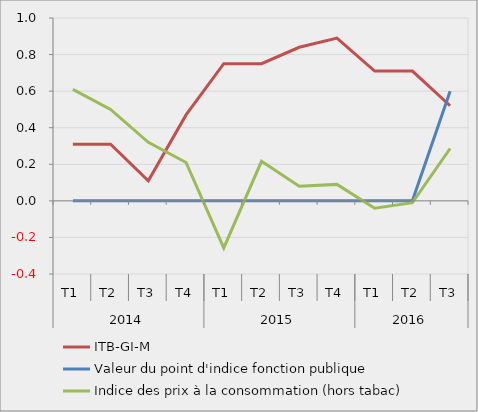
| Category | ITB-GI-M | Valeur du point d'indice fonction publique | Indice des prix à la consommation (hors tabac) |
|---|---|---|---|
| 0 | 0.31 | 0 | 0.61 |
| 1 | 0.31 | 0 | 0.5 |
| 2 | 0.11 | 0 | 0.32 |
| 3 | 0.47 | 0 | 0.21 |
| 4 | 0.75 | 0 | -0.257 |
| 5 | 0.75 | 0 | 0.216 |
| 6 | 0.84 | 0 | 0.08 |
| 7 | 0.89 | 0 | 0.09 |
| 8 | 0.71 | 0 | -0.04 |
| 9 | 0.71 | 0 | -0.01 |
| 10 | 0.52 | 0.6 | 0.286 |